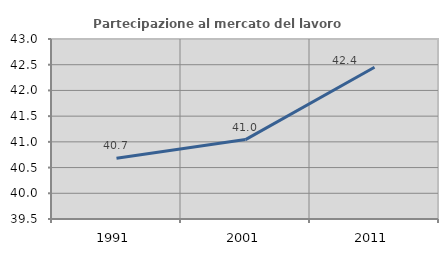
| Category | Partecipazione al mercato del lavoro  femminile |
|---|---|
| 1991.0 | 40.683 |
| 2001.0 | 41.044 |
| 2011.0 | 42.45 |